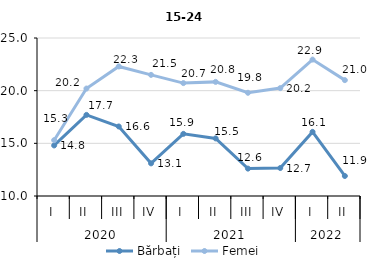
| Category | Bărbați | Femei |
|---|---|---|
| 0 | 14.8 | 15.3 |
| 1 | 17.7 | 20.2 |
| 2 | 16.6 | 22.3 |
| 3 | 13.1 | 21.5 |
| 4 | 15.899 | 20.718 |
| 5 | 15.467 | 20.834 |
| 6 | 12.6 | 19.8 |
| 7 | 12.657 | 20.243 |
| 8 | 16.088 | 22.949 |
| 9 | 11.9 | 21 |